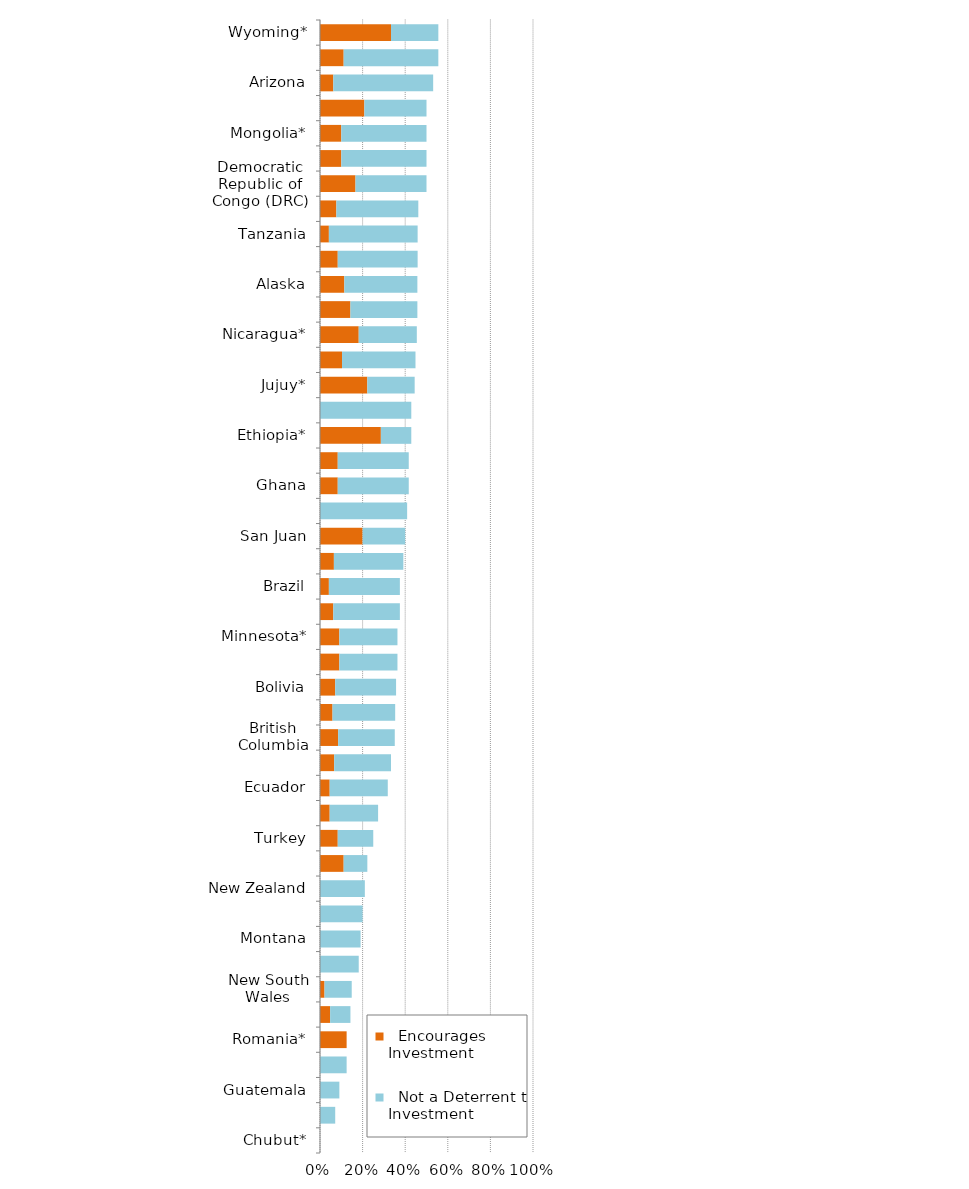
| Category |   Encourages Investment |   Not a Deterrent to Investment |
|---|---|---|
| Chubut* | 0 | 0 |
| Venezuela | 0 | 0.071 |
| Guatemala | 0 | 0.091 |
| Philippines* | 0 | 0.125 |
| Romania* | 0.125 | 0 |
| California | 0.048 | 0.095 |
| New South Wales | 0.021 | 0.128 |
| Mendoza | 0 | 0.182 |
| Montana | 0 | 0.19 |
| Victoria | 0 | 0.2 |
| New Zealand | 0 | 0.211 |
| China* | 0.111 | 0.111 |
| Turkey | 0.083 | 0.167 |
| Colombia | 0.045 | 0.227 |
| Ecuador | 0.045 | 0.273 |
| Norway | 0.067 | 0.267 |
| British Columbia | 0.085 | 0.266 |
| Nunavut | 0.059 | 0.294 |
| Bolivia | 0.071 | 0.286 |
| Colorado | 0.091 | 0.273 |
| Minnesota* | 0.091 | 0.273 |
| Washington | 0.062 | 0.312 |
| Brazil | 0.042 | 0.333 |
| Queensland | 0.065 | 0.326 |
| San Juan | 0.2 | 0.2 |
| Tasmania | 0 | 0.409 |
| Ghana | 0.083 | 0.333 |
| Zimbabwe | 0.083 | 0.333 |
| Ethiopia* | 0.286 | 0.143 |
| La Rioja* | 0 | 0.429 |
| Jujuy* | 0.222 | 0.222 |
| South Africa | 0.103 | 0.345 |
| Nicaragua* | 0.182 | 0.273 |
| Northwest Territories | 0.143 | 0.314 |
| Alaska | 0.114 | 0.343 |
| Indonesia | 0.083 | 0.375 |
| Tanzania | 0.042 | 0.417 |
| Spain* | 0.077 | 0.385 |
| Democratic Republic of Congo (DRC) | 0.167 | 0.333 |
| Kazakhstan* | 0.1 | 0.4 |
| Mongolia* | 0.1 | 0.4 |
| Greenland | 0.208 | 0.292 |
| Arizona | 0.062 | 0.469 |
| Michigan* | 0.111 | 0.444 |
| Wyoming* | 0.333 | 0.222 |